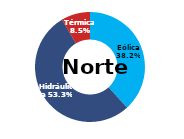
| Category | Norte |
|---|---|
| Eólica | 80.89 |
| Hidráulica | 112.755 |
| Solar | 0 |
| Térmica | 18.035 |